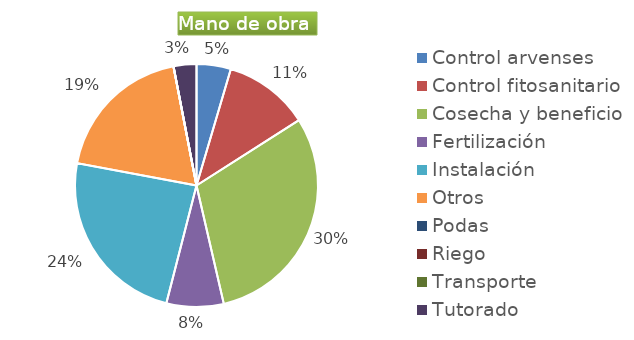
| Category | Series 0 |
|---|---|
| Control arvenses | 628284 |
| Control fitosanitario | 1570710 |
| Cosecha y beneficio | 4188560 |
| Fertilización | 1047140 |
| Instalación | 3298491 |
| Otros | 2617850 |
| Podas | 0 |
| Riego | 0 |
| Transporte | 0 |
| Tutorado | 418856 |